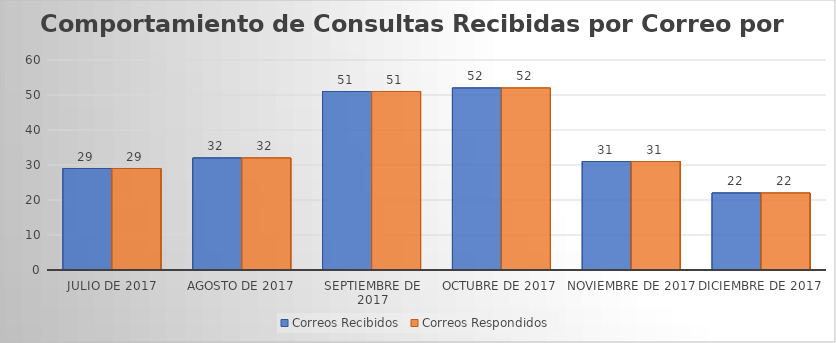
| Category | Correos Recibidos | Correos Respondidos |
|---|---|---|
| Julio de 2017 | 29 | 29 |
| Agosto de 2017 | 32 | 32 |
| Septiembre de 2017 | 51 | 51 |
| Octubre de 2017 | 52 | 52 |
| Noviembre de 2017 | 31 | 31 |
| Diciembre de 2017 | 22 | 22 |